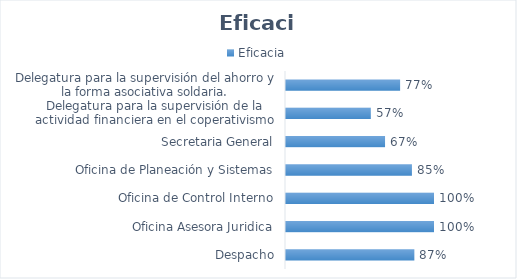
| Category | Eficacia |
|---|---|
| Despacho | 0.867 |
| Oficina Asesora Juridica | 1 |
| Oficina de Control Interno | 1 |
| Oficina de Planeación y Sistemas | 0.851 |
| Secretaria General | 0.669 |
| Delegatura para la supervisión de la actividad financiera en el coperativismo | 0.573 |
| Delegatura para la supervisión del ahorro y la forma asociativa soldaria. | 0.771 |